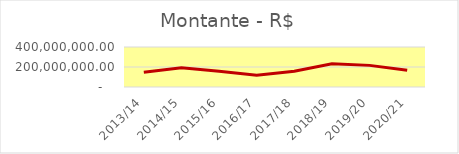
| Category | Montante |
|---|---|
| 2013/14 | 146848014.92 |
| 2014/15 | 192509821.23 |
| 2015/16 | 156627687.46 |
| 2016/17 | 118543652.32 |
| 2017/18 | 157222823.17 |
| 2018/19 | 232753463.05 |
| 2019/20 | 216263848.51 |
| 2020/21 | 166924600.58 |